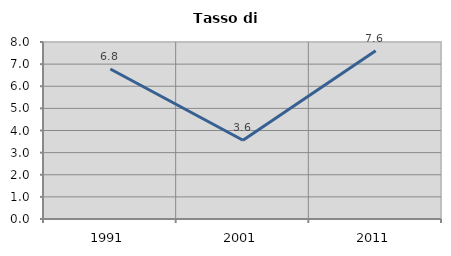
| Category | Tasso di disoccupazione   |
|---|---|
| 1991.0 | 6.78 |
| 2001.0 | 3.559 |
| 2011.0 | 7.606 |